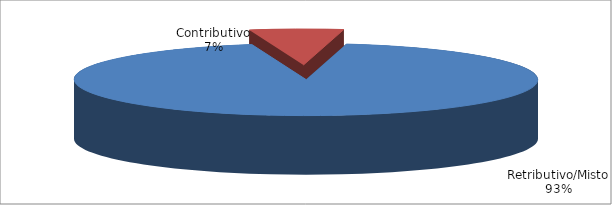
| Category | Series 1 |
|---|---|
| Retributivo/Misto | 27289 |
| Contributivo | 1906 |